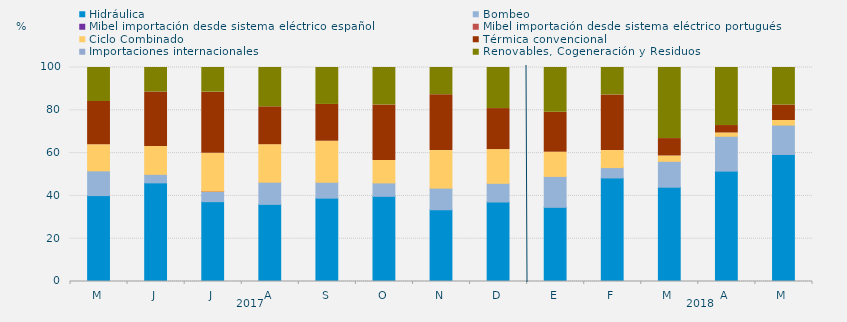
| Category | Hidráulica | Bombeo | Mibel importación desde sistema eléctrico español | Mibel importación desde sistema eléctrico portugués | Ciclo Combinado | Térmica convencional | Importaciones internacionales | Renovables, Cogeneración y Residuos |
|---|---|---|---|---|---|---|---|---|
| M | 40.143 | 11.559 | 0 | 0 | 12.186 | 20.228 | 0 | 15.883 |
| J | 46.088 | 3.981 | 0 | 0 | 13.032 | 25.463 | 0 | 11.435 |
| J | 37.298 | 4.783 | 0 | 0.134 | 17.675 | 28.595 | 0 | 11.514 |
| A | 36.044 | 10.361 | 0 | 0 | 17.518 | 17.708 | 0 | 18.369 |
| S | 38.947 | 7.407 | 0 | 0 | 19.201 | 17.187 | 0 | 17.257 |
| O | 39.807 | 6.25 | 0 | 0 | 10.484 | 25.963 | 0 | 17.496 |
| N | 33.519 | 10.116 | 0 | 0 | 17.546 | 26.088 | 0 | 12.731 |
| D | 37.142 | 8.737 | 0 | 0 | 15.771 | 19.153 | 0 | 19.198 |
| E | 34.655 | 14.449 | 0 | 0 | 11.313 | 18.638 | 0 | 20.945 |
| F | 48.388 | 4.836 | 0 | 0 | 7.961 | 25.992 | 0 | 12.822 |
| M | 44.056 | 12.113 | 0 | 0 | 2.49 | 8.12 | 0 | 33.221 |
| A | 51.574 | 16.296 | 0 | 0 | 1.528 | 3.472 | 0 | 27.13 |
| M | 59.364 | 13.732 | 0 | 0 | 2.128 | 7.236 | 0 | 17.54 |